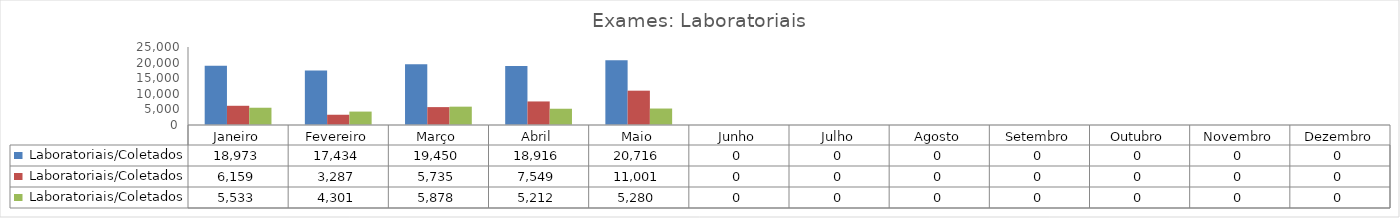
| Category | UMTS | UPA | PSI |
|---|---|---|---|
| Janeiro | 18973 | 6159 | 5533 |
| Fevereiro | 17434 | 3287 | 4301 |
| Março | 19450 | 5735 | 5878 |
| Abril | 18916 | 7549 | 5212 |
| Maio | 20716 | 11001 | 5280 |
| Junho | 0 | 0 | 0 |
| Julho | 0 | 0 | 0 |
| Agosto | 0 | 0 | 0 |
| Setembro | 0 | 0 | 0 |
| Outubro | 0 | 0 | 0 |
| Novembro | 0 | 0 | 0 |
| Dezembro | 0 | 0 | 0 |